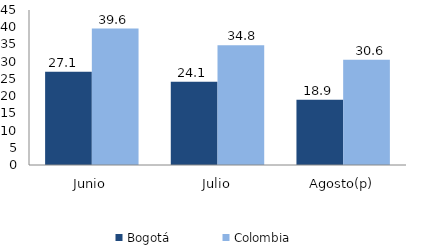
| Category | Bogotá | Colombia |
|---|---|---|
| Junio | 27.053 | 39.599 |
| Julio | 24.139 | 34.795 |
| Agosto(p) | 18.942 | 30.567 |